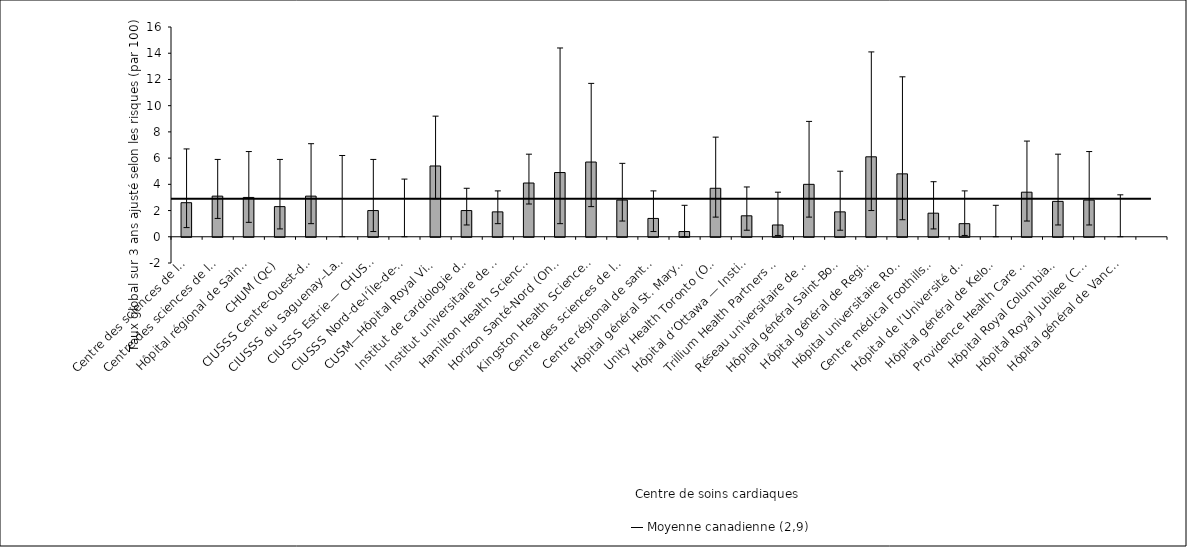
| Category | Taux ajusté selon 
les risques |
|---|---|
| Centre des sciences de la santé — St. John’s (T. -N.-L.) | 2.6 |
| Centre des sciences de la santé Queen Elizabeth II (N.-É.) | 3.1 |
| Hôpital régional de Saint John (N.-B.) | 3 |
| CHUM (Qc) | 2.3 |
| CIUSSS Centre-Ouest-de-l’Île-de-Mtl—Hôpital général juif (Qc) | 3.1 |
| CIUSSS du Saguenay–Lac-St-Jean—Hôpital de Chicoutimi (Qc) | 0 |
| CIUSSS Estrie — CHUS—Hôpital Fleurimont (Qc) | 2 |
| CIUSSS Nord-de-l’Île-de-Montréal—Hôpital du Sacré-Coeur de Montréal (Qc) | 0 |
| CUSM—Hôpital Royal Victoria (Qc) | 5.4 |
| Institut de cardiologie de Montréal (Qc) | 2 |
| Institut universitaire de cardiologie et pneumologie de Québec (Qc) | 1.9 |
| Hamilton Health Sciences (Ont.) | 4.1 |
| Horizon Santé-Nord (Ont.) | 4.9 |
| Kingston Health Sciences Centre (Ont.) | 5.7 |
| Centre des sciences de la santé de London (Ont.) | 2.8 |
| Centre régional de santé Southlake (Ont.) | 1.4 |
| Hôpital général St. Mary’s* (Ont.) | 0.4 |
| Unity Health Toronto (Ont.) | 3.7 |
| Hôpital d’Ottawa — Institut de cardiologie de l’Université d’Ottawa (Ont.) | 1.6 |
| Trillium Health Partners (Ont.) | 0.9 |
| Réseau universitaire de santé (Ont.) | 4 |
| Hôpital général Saint-Boniface (Man.) | 1.9 |
| Hôpital général de Regina (Sask.) | 6.1 |
| Hôpital universitaire Royal (Sask.) | 4.8 |
| Centre médical Foothills (Alb.) | 1.8 |
| Hôpital de l’Université de l’Alberta (Alb.) | 1 |
| Hôpital général de Kelowna* (C.-B.) | 0 |
| Providence Health Care — Hôpital St. Paul’s  (Vancouver) (C.-B.) | 3.4 |
| Hôpital Royal Columbian (C.-B.) | 2.7 |
| Hôpital Royal Jubilee (C.-B.) | 2.8 |
| Hôpital général de Vancouver (C.-B.) | 0 |